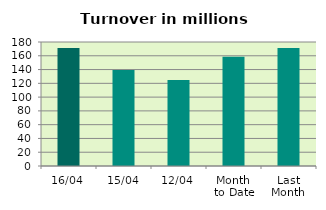
| Category | Series 0 |
|---|---|
| 16/04 | 171.227 |
| 15/04 | 139.443 |
| 12/04 | 124.914 |
| Month 
to Date | 158.582 |
| Last
Month | 171.15 |